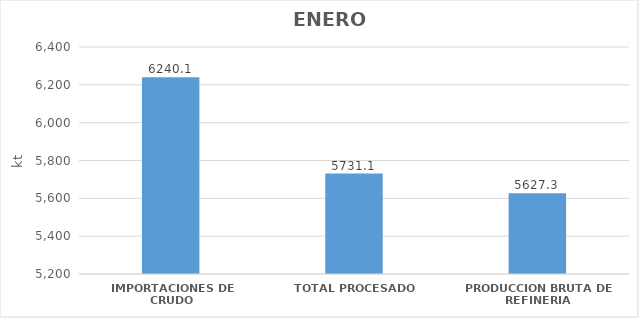
| Category | Series 0 |
|---|---|
| IMPORTACIONES DE CRUDO | 6240.129 |
| TOTAL PROCESADO | 5731.141 |
| PRODUCCION BRUTA DE REFINERIA | 5627.297 |